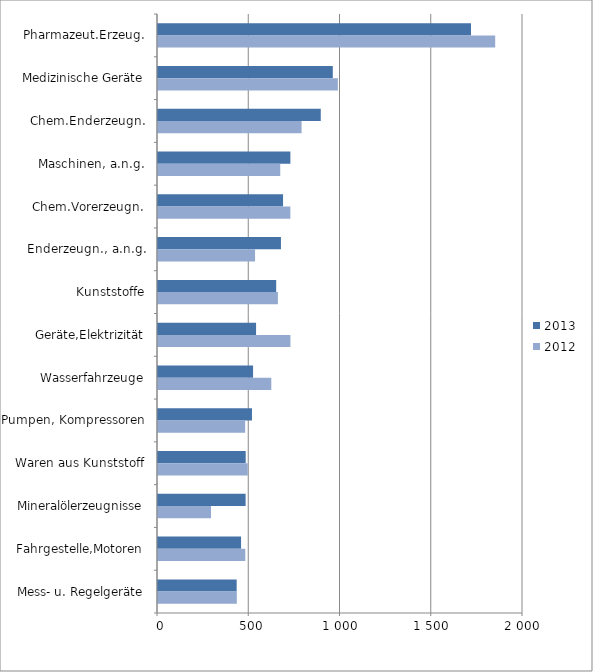
| Category | 2013 | 2012 |
|---|---|---|
| Pharmazeut.Erzeug. | 1715.119 | 1847.547 |
| Medizinische Geräte | 957.762 | 985.527 |
| Chem.Enderzeugn. | 891.778 | 786.732 |
| Maschinen, a.n.g. | 725.353 | 669.874 |
| Chem.Vorerzeugn. | 685.187 | 725.241 |
| Enderzeugn., a.n.g. | 673.654 | 531.89 |
| Kunststoffe | 647.623 | 656.945 |
| Geräte,Elektrizität | 537.404 | 725.542 |
| Wasserfahrzeuge | 520.92 | 620.786 |
| Pumpen, Kompressoren | 514.932 | 477.615 |
| Waren aus Kunststoff | 480.529 | 491.791 |
| Mineralölerzeugnisse | 480.083 | 290.432 |
| Fahrgestelle,Motoren | 455.082 | 478.392 |
| Mess- u. Regelgeräte | 431.064 | 431.929 |